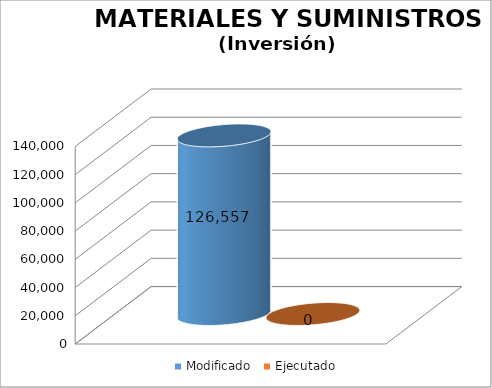
| Category | Modificado | Ejecutado |
|---|---|---|
| 0 | 126557 | 0 |